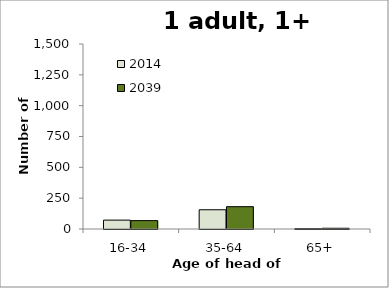
| Category | 2014 | 2039 |
|---|---|---|
| 16-34 | 72 | 68 |
| 35-64 | 156 | 181 |
| 65+ | 3 | 6 |